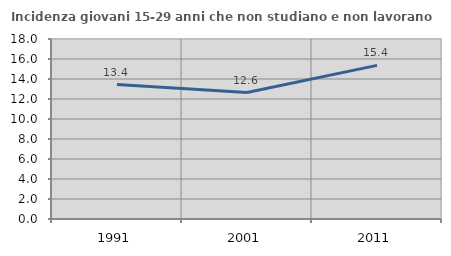
| Category | Incidenza giovani 15-29 anni che non studiano e non lavorano  |
|---|---|
| 1991.0 | 13.439 |
| 2001.0 | 12.642 |
| 2011.0 | 15.361 |